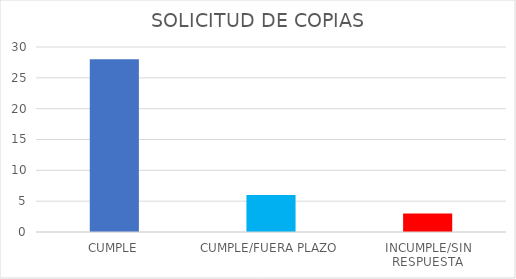
| Category | TOTAL |
|---|---|
| CUMPLE | 28 |
| CUMPLE/FUERA PLAZO | 6 |
| INCUMPLE/SIN RESPUESTA | 3 |